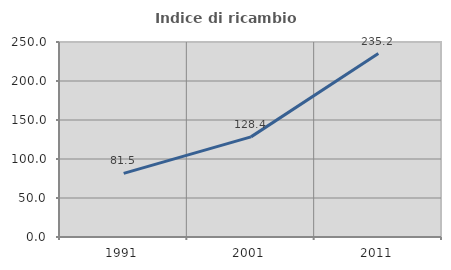
| Category | Indice di ricambio occupazionale  |
|---|---|
| 1991.0 | 81.538 |
| 2001.0 | 128.369 |
| 2011.0 | 235.185 |